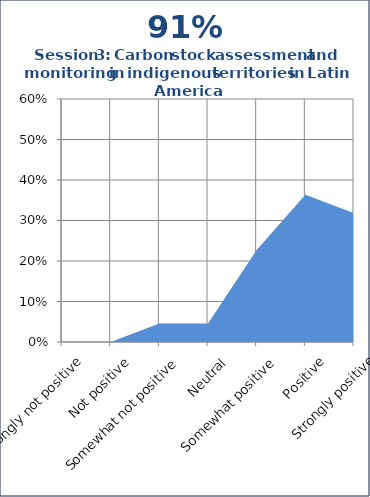
| Category | Series 1 |
|---|---|
| Strongly not positive | 0 |
| Not positive | 0 |
| Somewhat not positive | 0.045 |
| Neutral | 0.045 |
| Somewhat positive | 0.227 |
| Positive | 0.364 |
| Strongly positive | 0.318 |